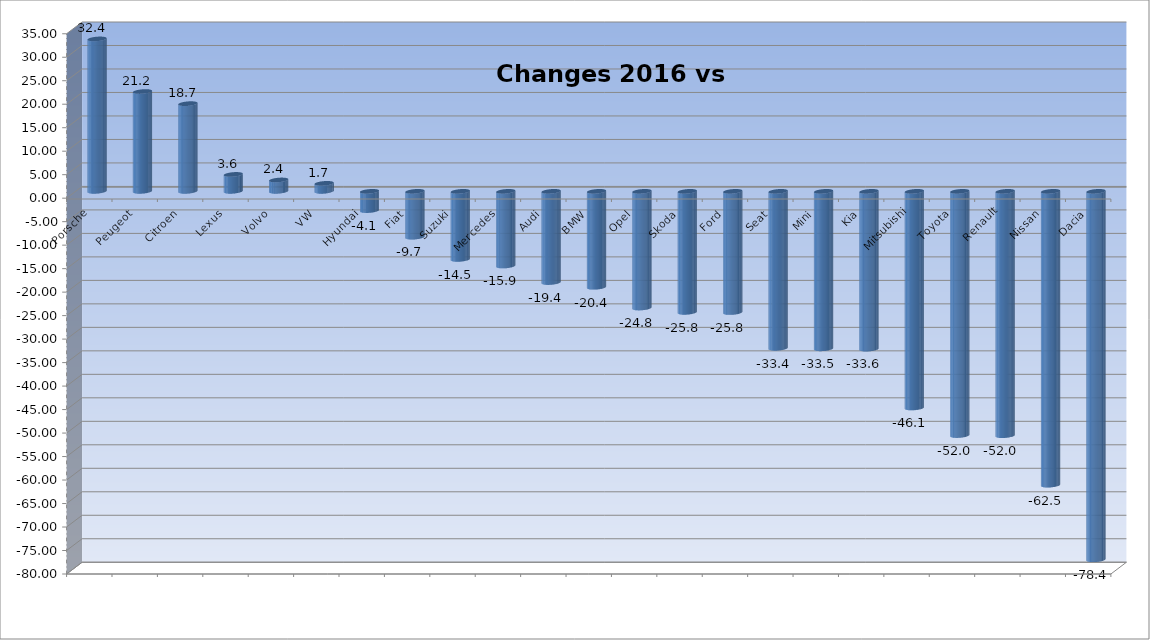
| Category | Ytd 2015 |
|---|---|
| Porsche | 32.444 |
| Peugeot | 21.248 |
| Citroen | 18.667 |
| Lexus | 3.604 |
| Volvo | 2.425 |
| VW | 1.705 |
| Hyundai | -4.095 |
| Fiat | -9.749 |
| Suzuki | -14.486 |
| Mercedes | -15.889 |
| Audi | -19.412 |
| BMW | -20.418 |
| Opel | -24.839 |
| Skoda | -25.759 |
| Ford | -25.794 |
| Seat | -33.417 |
| Mini | -33.518 |
| Kia | -33.586 |
| Mitsubishi | -46.109 |
| Toyota | -51.98 |
| Renault | -52.008 |
| Nissan | -62.544 |
| Dacia | -78.419 |